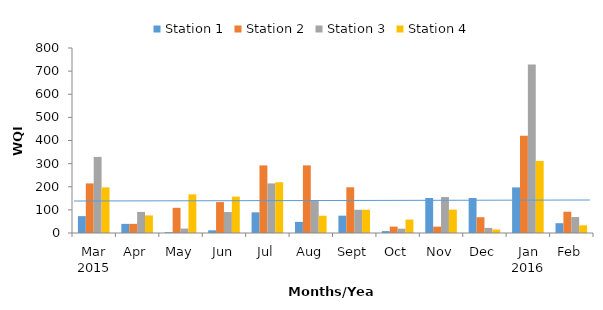
| Category | Station 1 | Station 2 | Station 3 | Station 4 |
|---|---|---|---|---|
| 0 | 72.94 | 214.384 | 329.138 | 197.167 |
| 1 | 39.473 | 39.473 | 91.079 | 76.096 |
| 2 | 3.385 | 108.948 | 19.059 | 167.074 |
| 3 | 11.629 | 133.637 | 90.607 | 157.366 |
| 4 | 89.453 | 292.369 | 214.429 | 219.329 |
| 5 | 48.174 | 292.369 | 139.979 | 74.519 |
| 6 | 75.094 | 197.669 | 100.499 | 100.499 |
| 7 | 8.289 | 27.588 | 18.678 | 58.1 |
| 8 | 151.398 | 27.588 | 155.731 | 101.088 |
| 9 | 151.398 | 68.317 | 22.013 | 15.085 |
| 10 | 197.24 | 420.614 | 728.496 | 311.622 |
| 11 | 42.434 | 91.945 | 68.976 | 33.279 |